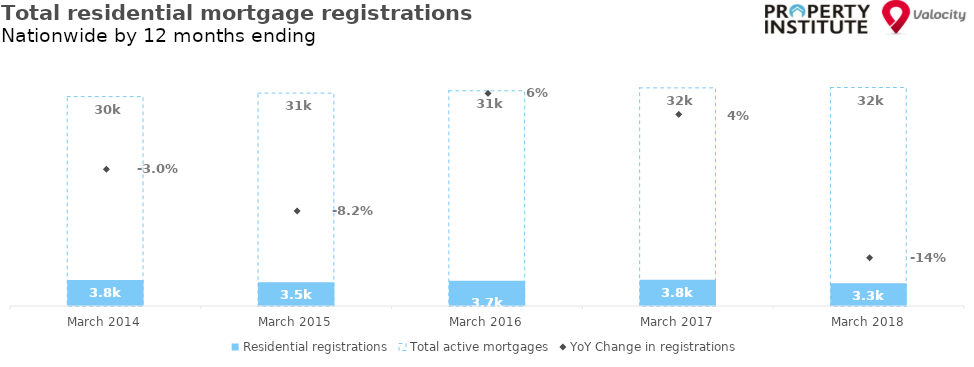
| Category | Residential registrations | Total active mortgages |
|---|---|---|
| 2014-03-01 | 3768 | 30410 |
| 2015-03-01 | 3460 | 30917 |
| 2016-03-01 | 3684 | 31254 |
| 2017-03-01 | 3826 | 31677 |
| 2018-03-01 | 3291 | 31730 |